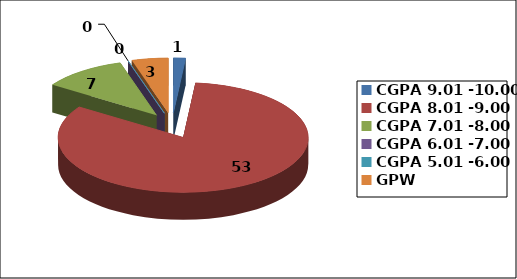
| Category | Series 0 |
|---|---|
| CGPA 9.01 -10.00 | 1 |
| CGPA 8.01 -9.00 | 53 |
| CGPA 7.01 -8.00 | 7 |
| CGPA 6.01 -7.00 | 0 |
| CGPA 5.01 -6.00 | 0 |
| GPW | 3 |